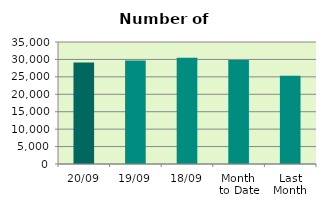
| Category | Series 0 |
|---|---|
| 20/09 | 29114 |
| 19/09 | 29704 |
| 18/09 | 30514 |
| Month 
to Date | 29855.714 |
| Last
Month | 25327.391 |